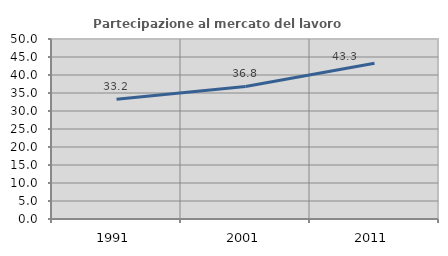
| Category | Partecipazione al mercato del lavoro  femminile |
|---|---|
| 1991.0 | 33.243 |
| 2001.0 | 36.811 |
| 2011.0 | 43.277 |